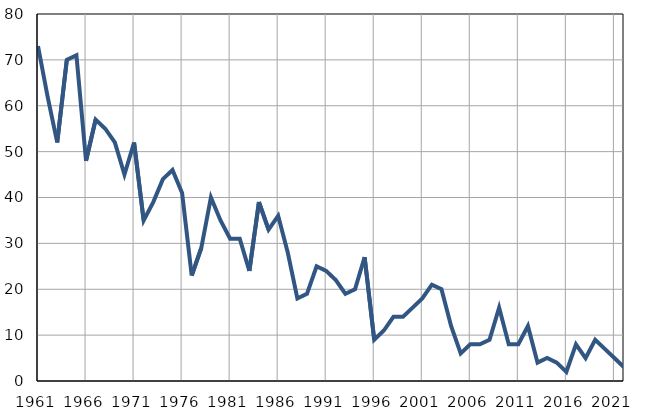
| Category | Infants
deaths |
|---|---|
| 1961.0 | 73 |
| 1962.0 | 62 |
| 1963.0 | 52 |
| 1964.0 | 70 |
| 1965.0 | 71 |
| 1966.0 | 48 |
| 1967.0 | 57 |
| 1968.0 | 55 |
| 1969.0 | 52 |
| 1970.0 | 45 |
| 1971.0 | 52 |
| 1972.0 | 35 |
| 1973.0 | 39 |
| 1974.0 | 44 |
| 1975.0 | 46 |
| 1976.0 | 41 |
| 1977.0 | 23 |
| 1978.0 | 29 |
| 1979.0 | 40 |
| 1980.0 | 35 |
| 1981.0 | 31 |
| 1982.0 | 31 |
| 1983.0 | 24 |
| 1984.0 | 39 |
| 1985.0 | 33 |
| 1986.0 | 36 |
| 1987.0 | 28 |
| 1988.0 | 18 |
| 1989.0 | 19 |
| 1990.0 | 25 |
| 1991.0 | 24 |
| 1992.0 | 22 |
| 1993.0 | 19 |
| 1994.0 | 20 |
| 1995.0 | 27 |
| 1996.0 | 9 |
| 1997.0 | 11 |
| 1998.0 | 14 |
| 1999.0 | 14 |
| 2000.0 | 16 |
| 2001.0 | 18 |
| 2002.0 | 21 |
| 2003.0 | 20 |
| 2004.0 | 12 |
| 2005.0 | 6 |
| 2006.0 | 8 |
| 2007.0 | 8 |
| 2008.0 | 9 |
| 2009.0 | 16 |
| 2010.0 | 8 |
| 2011.0 | 8 |
| 2012.0 | 12 |
| 2013.0 | 4 |
| 2014.0 | 5 |
| 2015.0 | 4 |
| 2016.0 | 2 |
| 2017.0 | 8 |
| 2018.0 | 5 |
| 2019.0 | 9 |
| 2020.0 | 7 |
| 2021.0 | 5 |
| 2022.0 | 3 |